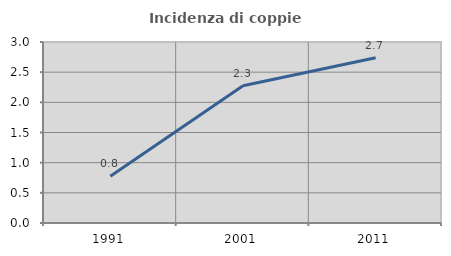
| Category | Incidenza di coppie miste |
|---|---|
| 1991.0 | 0.776 |
| 2001.0 | 2.276 |
| 2011.0 | 2.74 |